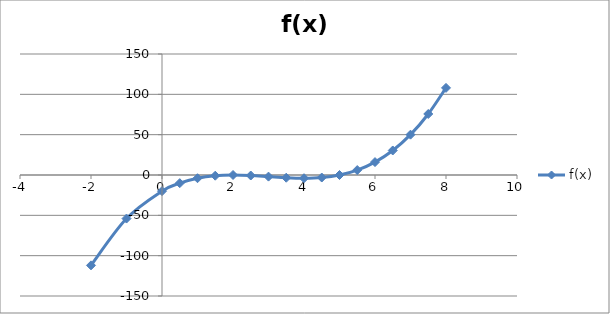
| Category | f(x) |
|---|---|
| -2.0 | -112 |
| -1.0 | -54 |
| 0.0 | -20 |
| 0.5 | -10.125 |
| 1.0 | -4 |
| 1.5 | -0.875 |
| 2.0 | 0 |
| 2.5 | -0.625 |
| 3.0 | -2 |
| 3.5 | -3.375 |
| 4.0 | -4 |
| 4.5 | -3.125 |
| 5.0 | 0 |
| 5.5 | 6.125 |
| 6.0 | 16 |
| 6.5 | 30.375 |
| 7.0 | 50 |
| 7.5 | 75.625 |
| 8.0 | 108 |